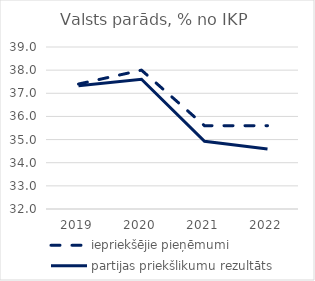
| Category | iepriekšējie pieņēmumi | partijas priekšlikumu rezultāts |
|---|---|---|
| 2019.0 | 37.4 | 37.33 |
| 2020.0 | 38 | 37.605 |
| 2021.0 | 35.6 | 34.926 |
| 2022.0 | 35.6 | 34.594 |